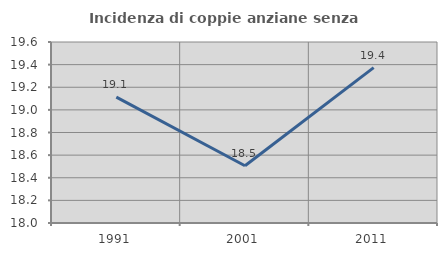
| Category | Incidenza di coppie anziane senza figli  |
|---|---|
| 1991.0 | 19.113 |
| 2001.0 | 18.506 |
| 2011.0 | 19.373 |